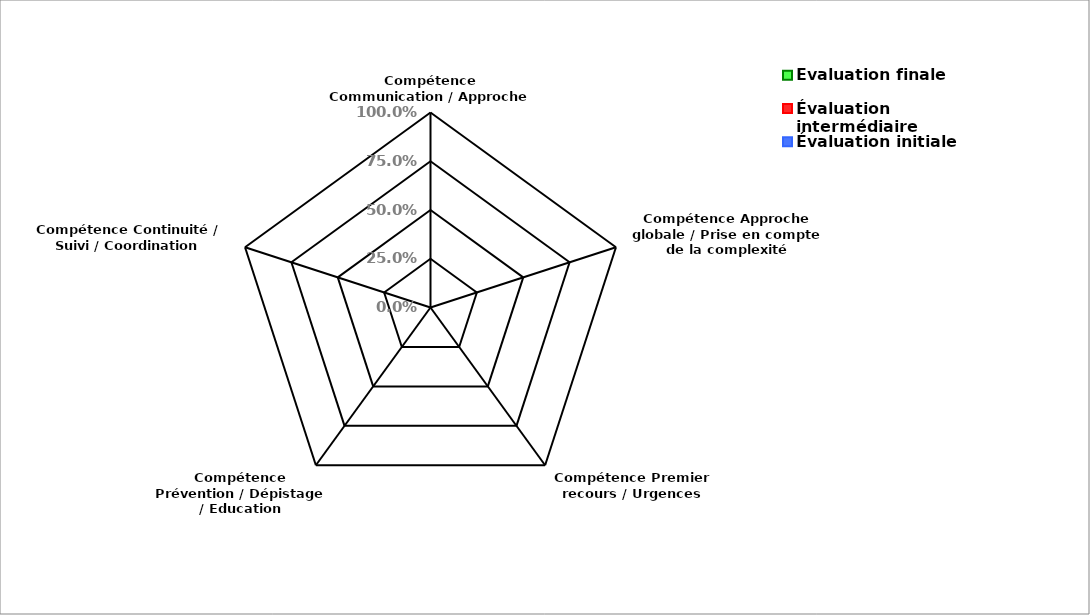
| Category | Évaluation finale | Évaluation intermédiaire | Évaluation initiale |
|---|---|---|---|
| Compétence Communication / Approche centrée patient | 0 | 0 | 0 |
| Compétence Approche globale / Prise en compte de la complexité | 0 | 0 | 0 |
| Compétence Premier recours / Urgences | 0 | 0 | 0 |
| Compétence Prévention / Dépistage / Education thérapeutique  | 0 | 0 | 0 |
| Compétence Continuité / Suivi / Coordination | 0 | 0 | 0 |